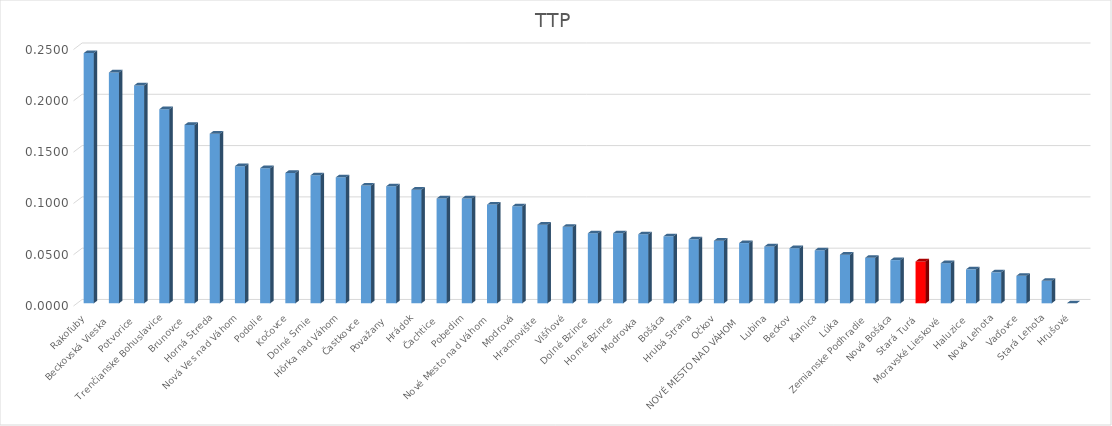
| Category | TTP |
|---|---|
| Rakoľuby | 0.244 |
| Beckovská Vieska | 0.225 |
| Potvorice | 0.212 |
| Trenčianske Bohuslavice | 0.189 |
| Brunovce | 0.174 |
| Horná Streda | 0.165 |
| Nová Ves nad Váhom | 0.134 |
| Podolie | 0.132 |
| Kočovce | 0.127 |
| Dolné Srnie | 0.125 |
| Hôrka nad Váhom | 0.123 |
| Častkovce | 0.115 |
| Považany | 0.114 |
| Hrádok | 0.111 |
| Čachtice | 0.102 |
| Pobedim | 0.102 |
| Nové Mesto nad Váhom | 0.096 |
| Modrová | 0.095 |
| Hrachovište | 0.077 |
| Višňové | 0.075 |
| Dolné Bzince | 0.068 |
| Horné Bzince | 0.068 |
| Modrovka | 0.067 |
| Bošáca | 0.065 |
| Hrubá Strana | 0.062 |
| Očkov | 0.061 |
| NOVÉ MESTO NAD VÁHOM | 0.059 |
| Lubina | 0.055 |
| Beckov | 0.054 |
| Kalnica | 0.052 |
| Lúka | 0.047 |
| Zemianske Podhradie | 0.044 |
| Nová Bošáca | 0.042 |
| Stará Turá | 0.041 |
| Moravské Lieskové | 0.039 |
| Haluzice | 0.033 |
| Nová Lehota | 0.03 |
| Vaďovce | 0.027 |
| Stará Lehota | 0.022 |
| Hrušové | 0 |